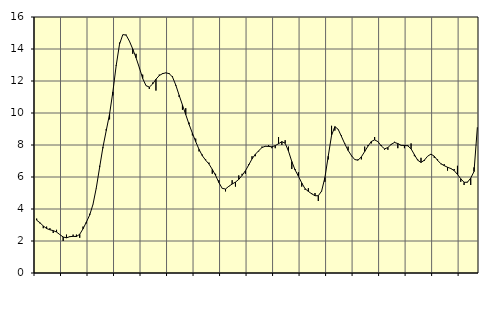
| Category | Piggar | Series 1 |
|---|---|---|
| nan | 3.4 | 3.3 |
| 87.0 | 3.1 | 3.14 |
| 87.0 | 2.8 | 2.94 |
| 87.0 | 2.9 | 2.78 |
| nan | 2.8 | 2.7 |
| 88.0 | 2.5 | 2.65 |
| 88.0 | 2.7 | 2.56 |
| 88.0 | 2.4 | 2.4 |
| nan | 2 | 2.25 |
| 89.0 | 2.4 | 2.2 |
| 89.0 | 2.3 | 2.27 |
| 89.0 | 2.4 | 2.29 |
| nan | 2.4 | 2.28 |
| 90.0 | 2.2 | 2.42 |
| 90.0 | 2.9 | 2.76 |
| 90.0 | 3.1 | 3.18 |
| nan | 3.7 | 3.62 |
| 91.0 | 4.3 | 4.29 |
| 91.0 | 5.3 | 5.32 |
| 91.0 | 6.7 | 6.6 |
| nan | 7.8 | 7.86 |
| 92.0 | 9 | 8.9 |
| 92.0 | 9.6 | 9.93 |
| 92.0 | 11.1 | 11.32 |
| nan | 13 | 12.96 |
| 93.0 | 14.4 | 14.29 |
| 93.0 | 14.9 | 14.9 |
| 93.0 | 14.9 | 14.87 |
| nan | 14.5 | 14.49 |
| 94.0 | 13.7 | 14 |
| 94.0 | 13.7 | 13.45 |
| 94.0 | 12.8 | 12.83 |
| nan | 12.4 | 12.16 |
| 95.0 | 11.7 | 11.71 |
| 95.0 | 11.5 | 11.62 |
| 95.0 | 11.9 | 11.81 |
| nan | 11.4 | 12.11 |
| 96.0 | 12.4 | 12.34 |
| 96.0 | 12.5 | 12.46 |
| 96.0 | 12.5 | 12.51 |
| nan | 12.5 | 12.46 |
| 97.0 | 12.3 | 12.25 |
| 97.0 | 11.7 | 11.74 |
| 97.0 | 11 | 11.11 |
| nan | 10.2 | 10.5 |
| 98.0 | 10.3 | 9.9 |
| 98.0 | 9.4 | 9.29 |
| 98.0 | 8.6 | 8.74 |
| nan | 8.4 | 8.21 |
| 99.0 | 7.6 | 7.73 |
| 99.0 | 7.4 | 7.33 |
| 99.0 | 7.1 | 7.05 |
| nan | 6.9 | 6.81 |
| 0.0 | 6.2 | 6.48 |
| 0.0 | 6.2 | 6.1 |
| 0.0 | 5.8 | 5.65 |
| nan | 5.3 | 5.29 |
| 1.0 | 5.1 | 5.25 |
| 1.0 | 5.4 | 5.42 |
| 1.0 | 5.8 | 5.56 |
| nan | 5.4 | 5.68 |
| 2.0 | 6.1 | 5.85 |
| 2.0 | 6.2 | 6.1 |
| 2.0 | 6.2 | 6.39 |
| nan | 6.8 | 6.75 |
| 3.0 | 7.3 | 7.13 |
| 3.0 | 7.3 | 7.42 |
| 3.0 | 7.6 | 7.64 |
| nan | 7.9 | 7.84 |
| 4.0 | 7.9 | 7.92 |
| 4.0 | 8 | 7.91 |
| 4.0 | 7.8 | 7.89 |
| nan | 7.8 | 7.96 |
| 5.0 | 8.5 | 8.08 |
| 5.0 | 8 | 8.21 |
| 5.0 | 8.3 | 8.11 |
| nan | 7.9 | 7.62 |
| 6.0 | 6.5 | 6.97 |
| 6.0 | 6.5 | 6.44 |
| 6.0 | 6.3 | 6.05 |
| nan | 5.4 | 5.63 |
| 7.0 | 5.2 | 5.27 |
| 7.0 | 5.3 | 5.1 |
| 7.0 | 5 | 4.95 |
| nan | 5 | 4.83 |
| 8.0 | 4.5 | 4.83 |
| 8.0 | 5.1 | 5.12 |
| 8.0 | 5.7 | 5.97 |
| nan | 7.1 | 7.3 |
| 9.0 | 9.2 | 8.6 |
| 9.0 | 8.9 | 9.15 |
| 9.0 | 9 | 8.98 |
| nan | 8.6 | 8.53 |
| 10.0 | 8.1 | 8.07 |
| 10.0 | 7.9 | 7.66 |
| 10.0 | 7.3 | 7.34 |
| nan | 7.1 | 7.09 |
| 11.0 | 7.1 | 7.05 |
| 11.0 | 7.1 | 7.26 |
| 11.0 | 7.9 | 7.59 |
| nan | 8 | 7.93 |
| 12.0 | 8.1 | 8.22 |
| 12.0 | 8.5 | 8.32 |
| 12.0 | 8.2 | 8.21 |
| nan | 8 | 7.94 |
| 13.0 | 7.7 | 7.76 |
| 13.0 | 7.7 | 7.84 |
| 13.0 | 8 | 8.04 |
| nan | 8.2 | 8.16 |
| 14.0 | 7.8 | 8.09 |
| 14.0 | 8 | 7.98 |
| 14.0 | 7.8 | 7.97 |
| nan | 8 | 7.95 |
| 15.0 | 8.1 | 7.76 |
| 15.0 | 7.3 | 7.4 |
| 15.0 | 7.1 | 7.05 |
| nan | 7.2 | 6.91 |
| 16.0 | 7 | 7.05 |
| 16.0 | 7.3 | 7.3 |
| 16.0 | 7.4 | 7.43 |
| nan | 7.2 | 7.3 |
| 17.0 | 7.1 | 7.04 |
| 17.0 | 6.8 | 6.83 |
| 17.0 | 6.8 | 6.71 |
| nan | 6.4 | 6.61 |
| 18.0 | 6.5 | 6.53 |
| 18.0 | 6.5 | 6.4 |
| 18.0 | 6.7 | 6.16 |
| nan | 5.7 | 5.89 |
| 19.0 | 5.5 | 5.67 |
| 19.0 | 5.7 | 5.67 |
| 19.0 | 5.5 | 5.93 |
| nan | 6.6 | 6.34 |
| 20.0 | 9.1 | 9.08 |